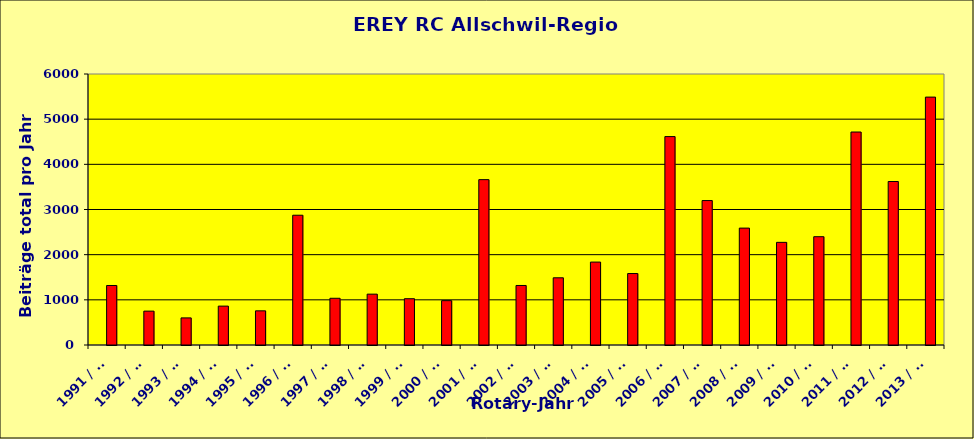
| Category | Series 0 | Series 1 |
|---|---|---|
| 1991 / 92 |  | 1317.66 |
| 1992 / 93 |  | 750 |
| 1993 / 94 |  | 600 |
| 1994 / 95 |  | 861 |
| 1995 / 96 |  | 756.52 |
| 1996 / 97 |  | 2873.08 |
| 1997 / 98 |  | 1034.48 |
| 1998 / 99 |  | 1125.93 |
| 1999 / 00 |  | 1025 |
| 2000 / 01 |  | 982.04 |
| 2001 / 02 |  | 3661.37 |
| 2002 / 03 |  | 1317.86 |
| 2003 / 04 |  | 1488.19 |
| 2004 / 05 |  | 1835.8 |
| 2005 / 06 |  | 1582.03 |
| 2006 / 07 |  | 4614.21 |
| 2007 / 08 |  | 3198.13 |
| 2008 / 09 |  | 2588.28 |
| 2009 / 10 |  | 2272.73 |
| 2010 / 11 |  | 2397.96 |
| 2011 / 12 |  | 4715.46 |
| 2012 / 13 |  | 3619.77 |
| 2013 / 14 |  | 5488.51 |